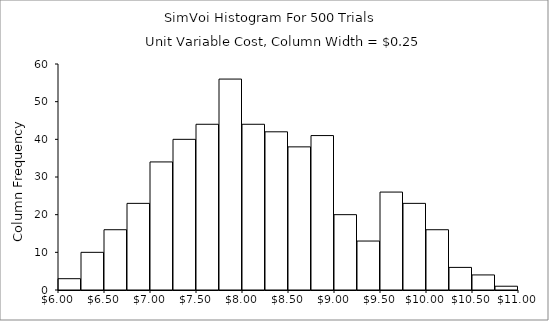
| Category | Series 0 |
|---|---|
| 6.25 | 3 |
| 6.5 | 10 |
| 6.75 | 16 |
| 7.0 | 23 |
| 7.25 | 34 |
| 7.5 | 40 |
| 7.75 | 44 |
| 8.0 | 56 |
| 8.25 | 44 |
| 8.5 | 42 |
| 8.75 | 38 |
| 9.0 | 41 |
| 9.25 | 20 |
| 9.5 | 13 |
| 9.75 | 26 |
| 10.0 | 23 |
| 10.25 | 16 |
| 10.5 | 6 |
| 10.75 | 4 |
| 11.0 | 1 |